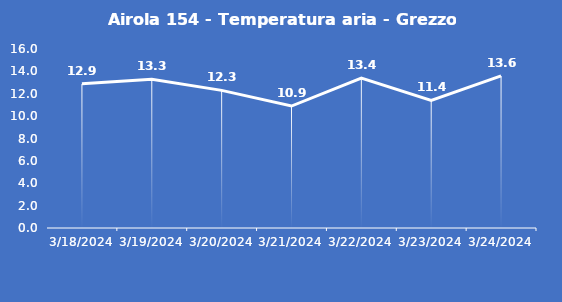
| Category | Airola 154 - Temperatura aria - Grezzo (°C) |
|---|---|
| 3/18/24 | 12.9 |
| 3/19/24 | 13.3 |
| 3/20/24 | 12.3 |
| 3/21/24 | 10.9 |
| 3/22/24 | 13.4 |
| 3/23/24 | 11.4 |
| 3/24/24 | 13.6 |